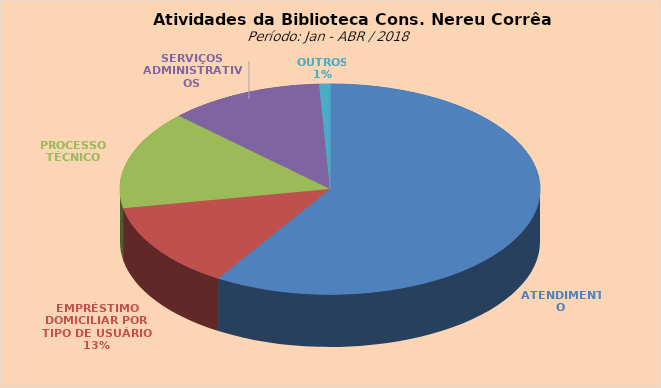
| Category | Series 0 |
|---|---|
| ATENDIMENTO | 4030 |
| EMPRÉSTIMO DOMICILIAR POR TIPO DE USUÁRIO | 902 |
| PROCESSO TÉCNICO | 1037 |
| SERVIÇOS ADMINISTRATIVOS | 814 |
| OUTROS | 57 |